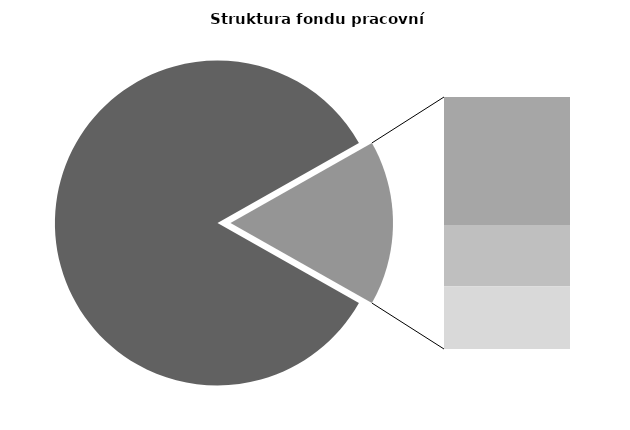
| Category | Series 0 |
|---|---|
| Průměrná měsíční odpracovaná doba bez přesčasu | 141.073 |
| Dovolená | 14.053 |
| Nemoc | 6.719 |
| Jiné | 6.896 |